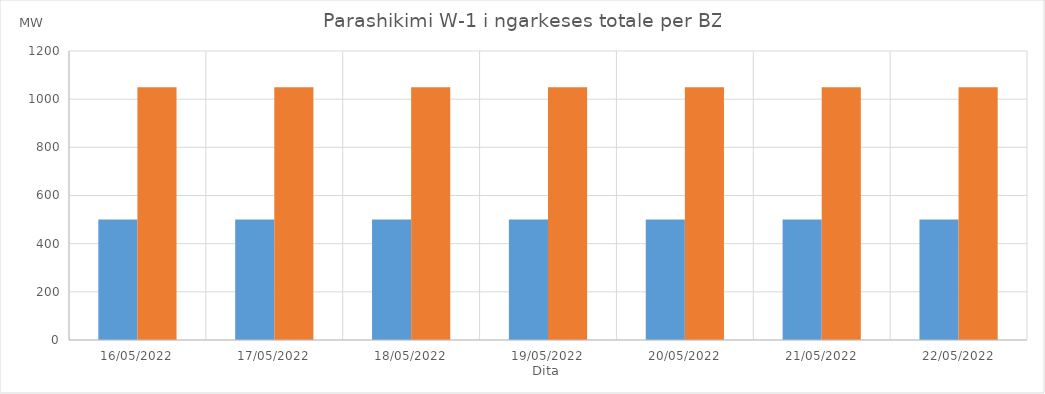
| Category | Min (MW) | Max (MW) |
|---|---|---|
| 16/05/2022 | 500 | 1050 |
| 17/05/2022 | 500 | 1050 |
| 18/05/2022 | 500 | 1050 |
| 19/05/2022 | 500 | 1050 |
| 20/05/2022 | 500 | 1050 |
| 21/05/2022 | 500 | 1050 |
| 22/05/2022 | 500 | 1050 |